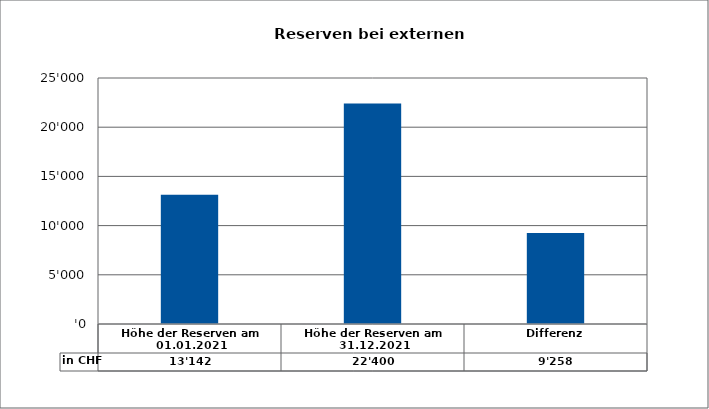
| Category | in CHF |
|---|---|
| Höhe der Reserven am 01.01.2021 | 13142 |
| Höhe der Reserven am 31.12.2021 | 22400 |
| Differenz | 9258 |